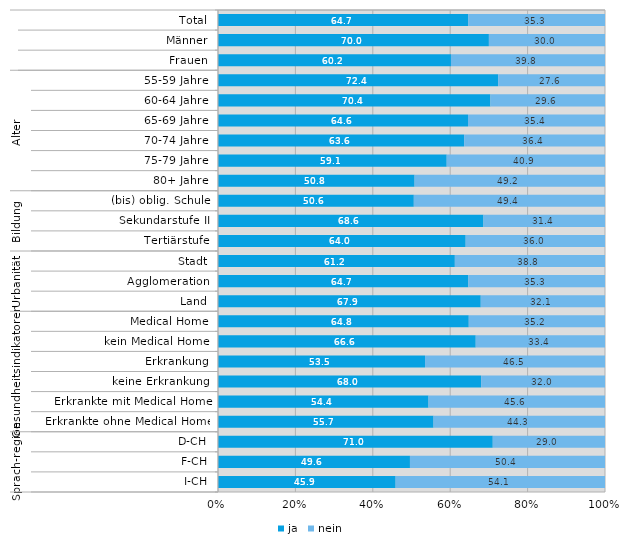
| Category | ja | nein |
|---|---|---|
| 0 | 64.7 | 35.3 |
| 1 | 70 | 30 |
| 2 | 60.2 | 39.8 |
| 3 | 72.4 | 27.6 |
| 4 | 70.4 | 29.6 |
| 5 | 64.6 | 35.4 |
| 6 | 63.6 | 36.4 |
| 7 | 59.1 | 40.9 |
| 8 | 50.8 | 49.2 |
| 9 | 50.6 | 49.4 |
| 10 | 68.6 | 31.4 |
| 11 | 64 | 36 |
| 12 | 61.2 | 38.8 |
| 13 | 64.7 | 35.3 |
| 14 | 67.9 | 32.1 |
| 15 | 64.8 | 35.2 |
| 16 | 66.6 | 33.4 |
| 17 | 53.5 | 46.5 |
| 18 | 68 | 32 |
| 19 | 54.4 | 45.6 |
| 20 | 55.7 | 44.3 |
| 21 | 71 | 29 |
| 22 | 49.6 | 50.4 |
| 23 | 45.9 | 54.1 |